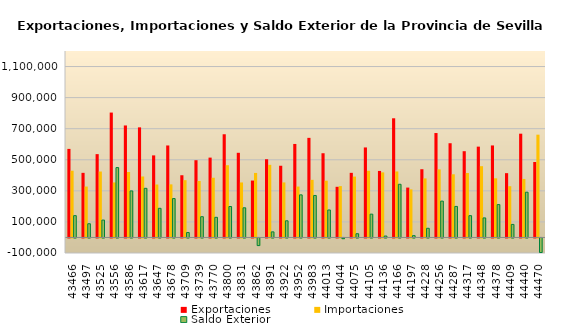
| Category | Exportaciones | Importaciones | Saldo Exterior |
|---|---|---|---|
| 2019-01-01 | 569931.277 | 429494.742 | 140436.534 |
| 2019-02-01 | 415835.783 | 327549.688 | 88286.094 |
| 2019-03-01 | 536289.213 | 424398.806 | 111890.407 |
| 2019-04-01 | 803799.832 | 354056.045 | 449743.787 |
| 2019-05-01 | 720786.65 | 421173.779 | 299612.871 |
| 2019-06-01 | 708636.402 | 392376.669 | 316259.734 |
| 2019-07-01 | 528188.273 | 340690.207 | 187498.067 |
| 2019-08-01 | 592019.511 | 341747.051 | 250272.46 |
| 2019-09-01 | 400434 | 368760 | 31674 |
| 2019-10-01 | 497188.203 | 363534.861 | 133653.342 |
| 2019-11-01 | 513902.151 | 384307.903 | 129594.248 |
| 2019-12-01 | 664224.395 | 464969.096 | 199255.3 |
| 2020-01-01 | 544870.53 | 354001.6 | 190868.93 |
| 2020-02-01 | 366257.69 | 415208.86 | -48951.17 |
| 2020-03-01 | 503457.96 | 467455.72 | 36002.24 |
| 2020-04-01 | 461491.76 | 354222.35 | 107269.41 |
| 2020-05-01 | 601776.55 | 327669.6 | 274106.95 |
| 2020-06-01 | 641019.7 | 370799.77 | 270219.93 |
| 2020-07-01 | 542062.84 | 365220.14 | 176842.7 |
| 2020-08-01 | 326019.87 | 330571.15 | -4551.28 |
| 2020-09-01 | 415851.9 | 391765.11 | 24086.79 |
| 2020-10-01 | 579330.62 | 429257.84 | 150072.78 |
| 2020-11-01 | 428116.983 | 418885.529 | 9231.454 |
| 2020-12-01 | 766984.753 | 424753.82 | 342230.933 |
| 2021-01-01 | 321034.51 | 309401.55 | 11632.96 |
| 2021-02-01 | 439118.25 | 380078.53 | 59039.72 |
| 2021-03-01 | 672033.91 | 438109.5 | 233924.41 |
| 2021-04-01 | 606425.01 | 406580.73 | 199844.28 |
| 2021-05-01 | 555191.59 | 414958.96 | 140232.63 |
| 2021-06-01 | 584517.86 | 458749.69 | 125768.17 |
| 2021-07-01 | 592215.46 | 380627.08 | 211588.38 |
| 2021-08-01 | 413833.07 | 329895.94 | 83937.13 |
| 2021-09-01 | 667860.28 | 376602.79 | 291257.49 |
| 2021-10-01 | 485511.53 | 661520.46 | -176008.93 |